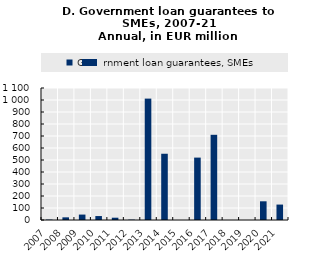
| Category | Government loan guarantees, SMEs |
|---|---|
| 2007.0 | 3.28 |
| 2008.0 | 22.22 |
| 2009.0 | 45.2 |
| 2010.0 | 32.93 |
| 2011.0 | 19.15 |
| 2012.0 | 3.07 |
| 2013.0 | 1011.6 |
| 2014.0 | 552.1 |
| 2015.0 | 0 |
| 2016.0 | 520 |
| 2017.0 | 710 |
| 2018.0 | 0 |
| 2019.0 | 0 |
| 2020.0 | 155.86 |
| 2021.0 | 128.571 |